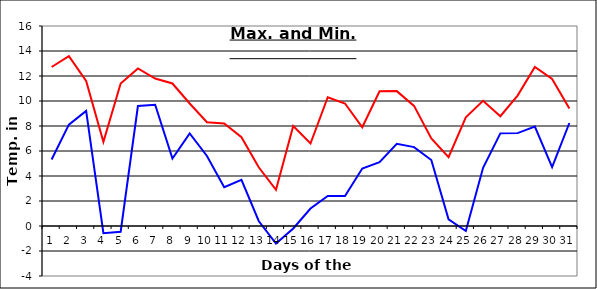
| Category | Series 0 | Series 1 |
|---|---|---|
| 0 | 12.72 | 5.32 |
| 1 | 13.59 | 8.11 |
| 2 | 11.6 | 9.21 |
| 3 | 6.73 | -0.57 |
| 4 | 11.4 | -0.46 |
| 5 | 12.6 | 9.6 |
| 6 | 11.8 | 9.7 |
| 7 | 11.4 | 5.4 |
| 8 | 9.8 | 7.4 |
| 9 | 8.3 | 5.6 |
| 10 | 8.2 | 3.1 |
| 11 | 7.1 | 3.7 |
| 12 | 4.7 | 0.4 |
| 13 | 2.9 | -1.4 |
| 14 | 8 | -0.2 |
| 15 | 6.6 | 1.4 |
| 16 | 10.3 | 2.4 |
| 17 | 9.8 | 2.4 |
| 18 | 7.9 | 4.6 |
| 19 | 10.78 | 5.1 |
| 20 | 10.79 | 6.57 |
| 21 | 9.61 | 6.31 |
| 22 | 7.01 | 5.28 |
| 23 | 5.5 | 0.53 |
| 24 | 8.7 | -0.4 |
| 25 | 10.01 | 4.66 |
| 26 | 8.78 | 7.41 |
| 27 | 10.43 | 7.43 |
| 28 | 12.72 | 7.95 |
| 29 | 11.77 | 4.71 |
| 30 | 9.4 | 8.24 |